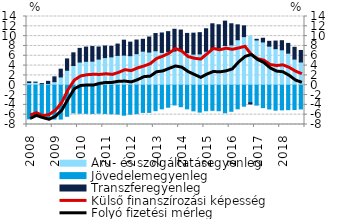
| Category | Áru- és szolgáltatásegyenleg | Jövedelemegyenleg | Transzferegyenleg |
|---|---|---|---|
| 2008.0 | 0.542 | -6.855 | 0.144 |
| 2008.0 | 0.607 | -6.318 | 0.016 |
| 2008.0 | 0.276 | -6.627 | 0.057 |
| 2008.0 | 0.356 | -6.874 | 0.434 |
| 2009.0 | 0.725 | -6.896 | 0.982 |
| 2009.0 | 1.689 | -6.9 | 1.582 |
| 2009.0 | 3.052 | -6.333 | 2.306 |
| 2009.0 | 4.018 | -5.649 | 2.584 |
| 2010.0 | 4.723 | -5.709 | 2.785 |
| 2010.0 | 4.875 | -5.734 | 2.897 |
| 2010.0 | 4.906 | -5.753 | 2.976 |
| 2010.0 | 5.323 | -5.696 | 2.468 |
| 2011.0 | 5.632 | -5.751 | 2.353 |
| 2011.0 | 5.782 | -5.822 | 2.145 |
| 2011.0 | 6.075 | -5.873 | 2.309 |
| 2011.0 | 6.133 | -6.11 | 3.044 |
| 2012.0 | 6.016 | -5.905 | 2.764 |
| 2012.0 | 6.423 | -5.787 | 2.783 |
| 2012.0 | 6.938 | -5.537 | 2.417 |
| 2012.0 | 6.753 | -5.533 | 3.069 |
| 2013.0 | 7.019 | -5.186 | 3.511 |
| 2013.0 | 6.687 | -4.813 | 3.957 |
| 2013.0 | 6.877 | -4.481 | 4.041 |
| 2013.0 | 6.964 | -4.021 | 4.439 |
| 2014.0 | 7.045 | -4.377 | 4.196 |
| 2014.0 | 6.644 | -4.812 | 3.912 |
| 2014.0 | 6.341 | -5.217 | 4.266 |
| 2014.0 | 6.378 | -5.478 | 4.33 |
| 2015.0 | 6.926 | -5.202 | 4.579 |
| 2015.0 | 7.419 | -5.119 | 5.096 |
| 2015.0 | 7.611 | -5.199 | 4.703 |
| 2015.0 | 8.097 | -5.618 | 4.963 |
| 2016.0 | 8.211 | -5.308 | 4.308 |
| 2016.0 | 9.27 | -4.808 | 3.036 |
| 2016.0 | 9.902 | -4.273 | 2.193 |
| 2016.0 | 9.98 | -3.582 | -0.238 |
| 2017.0 | 9.216 | -4.054 | 0.144 |
| 2017.0 | 8.816 | -4.57 | 0.754 |
| 2017.0 | 7.963 | -4.839 | 0.982 |
| 2017.0 | 7.449 | -5.084 | 1.549 |
| 2018.0 | 7.218 | -5.021 | 1.853 |
| 2018.0 | 6.535 | -4.979 | 1.986 |
| 2018.0 | 5.325 | -4.959 | 2.403 |
| 2018.0 | 4.734 | -4.835 | 2.347 |